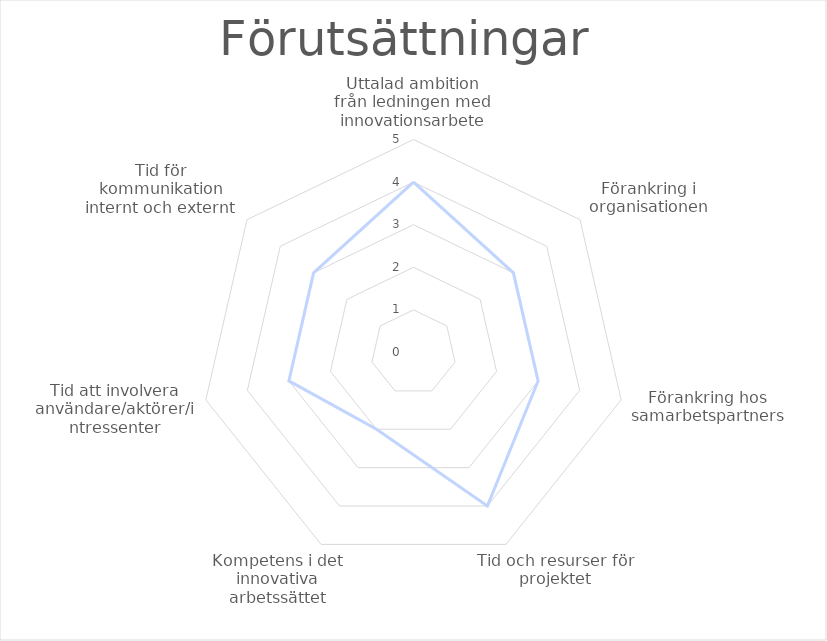
| Category | Förutsättningar |
|---|---|
| Uttalad ambition från ledningen med innovationsarbete | 4 |
| Förankring i organisationen | 3 |
| Förankring hos samarbetspartners | 3 |
| Tid och resurser för projektet | 4 |
| Kompetens i det innovativa arbetssättet | 2 |
| Tid att involvera användare/aktörer/intressenter | 3 |
| Tid för kommunikation internt och externt | 3 |